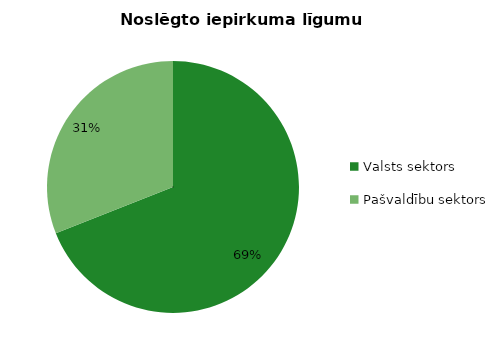
| Category | Noslēgto iepirkuma līgumu skaits |
|---|---|
| Valsts sektors | 8269 |
| Pašvaldību sektors | 3714 |